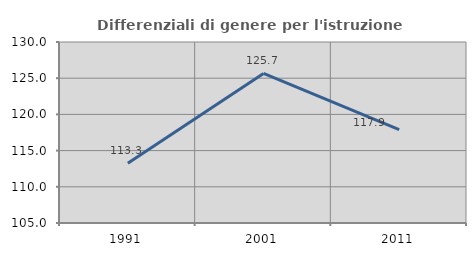
| Category | Differenziali di genere per l'istruzione superiore |
|---|---|
| 1991.0 | 113.258 |
| 2001.0 | 125.657 |
| 2011.0 | 117.911 |